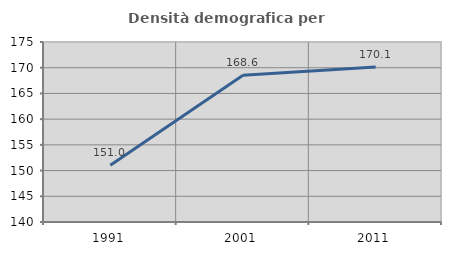
| Category | Densità demografica |
|---|---|
| 1991.0 | 151.021 |
| 2001.0 | 168.556 |
| 2011.0 | 170.14 |